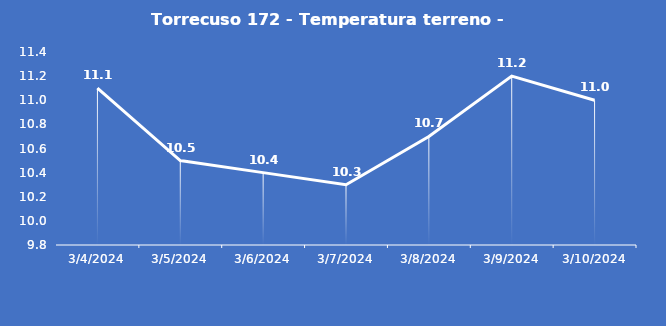
| Category | Torrecuso 172 - Temperatura terreno - Grezzo (°C) |
|---|---|
| 3/4/24 | 11.1 |
| 3/5/24 | 10.5 |
| 3/6/24 | 10.4 |
| 3/7/24 | 10.3 |
| 3/8/24 | 10.7 |
| 3/9/24 | 11.2 |
| 3/10/24 | 11 |